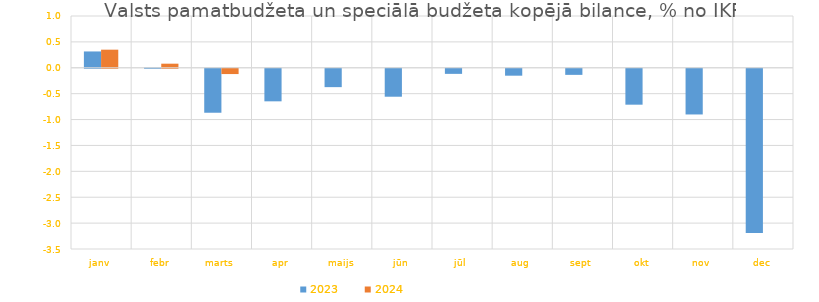
| Category | 2023 | 2024 |
|---|---|---|
| janv | 0.315 | 0.349 |
| febr | 0.007 | 0.079 |
| marts | -0.849 | -0.102 |
| apr | -0.629 | 0 |
| maijs | -0.355 | 0 |
| jūn | -0.54 | 0 |
| jūl | -0.098 | 0 |
| aug | -0.134 | 0 |
| sept | -0.118 | 0 |
| okt | -0.693 | 0 |
| nov | -0.882 | 0 |
| dec | -3.171 | 0 |